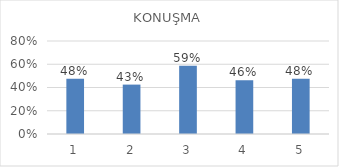
| Category | Series 0 |
|---|---|
| 0 | 0.475 |
| 1 | 0.425 |
| 2 | 0.588 |
| 3 | 0.462 |
| 4 | 0.475 |